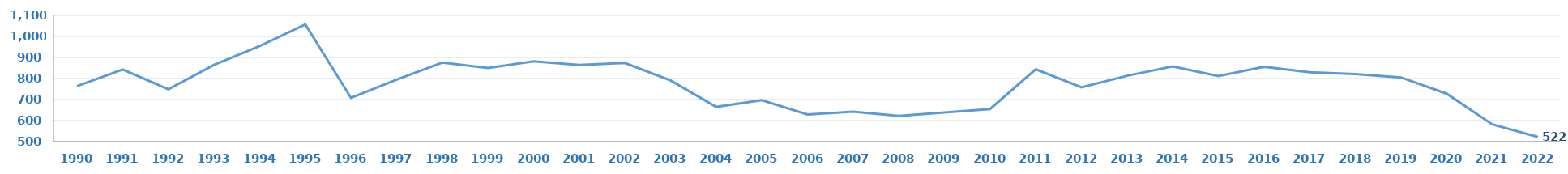
| Category | CAP |
|---|---|
| 1990.0 | 764 |
| 1991.0 | 843 |
| 1992.0 | 749 |
| 1993.0 | 865 |
| 1994.0 | 954 |
| 1995.0 | 1057 |
| 1996.0 | 708 |
| 1997.0 | 795 |
| 1998.0 | 876 |
| 1999.0 | 850 |
| 2000.0 | 882 |
| 2001.0 | 864 |
| 2002.0 | 874 |
| 2003.0 | 791 |
| 2004.0 | 665 |
| 2005.0 | 697 |
| 2006.0 | 629 |
| 2007.0 | 642 |
| 2008.0 | 622 |
| 2009.0 | 638 |
| 2010.0 | 655 |
| 2011.0 | 844 |
| 2012.0 | 758 |
| 2013.0 | 813 |
| 2014.0 | 858 |
| 2015.0 | 812 |
| 2016.0 | 856 |
| 2017.0 | 830 |
| 2018.0 | 821 |
| 2019.0 | 805 |
| 2020.0 | 728 |
| 2021.0 | 582 |
| 2022.0 | 522 |